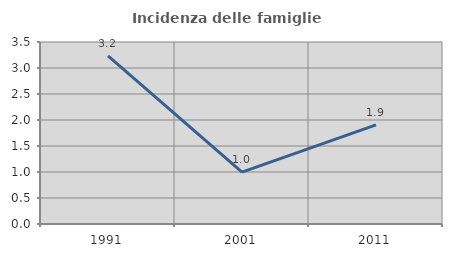
| Category | Incidenza delle famiglie numerose |
|---|---|
| 1991.0 | 3.235 |
| 2001.0 | 0.999 |
| 2011.0 | 1.906 |